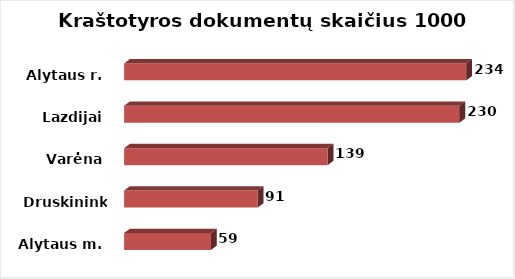
| Category | Series 0 |
|---|---|
| Alytaus m. | 59.486 |
| Druskininkai | 91.449 |
| Varėna | 139.376 |
| Lazdijai | 229.553 |
| Alytaus r. | 234.308 |